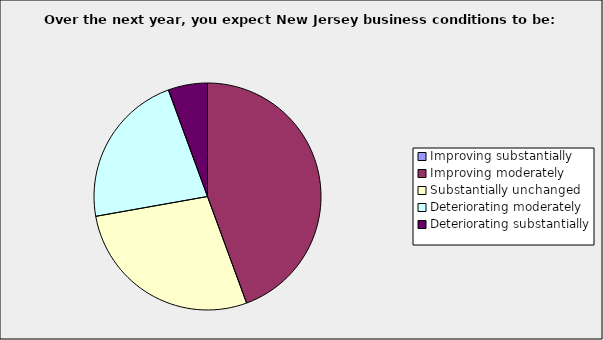
| Category | Series 0 |
|---|---|
| Improving substantially | 0 |
| Improving moderately | 0.444 |
| Substantially unchanged | 0.278 |
| Deteriorating moderately | 0.222 |
| Deteriorating substantially | 0.056 |